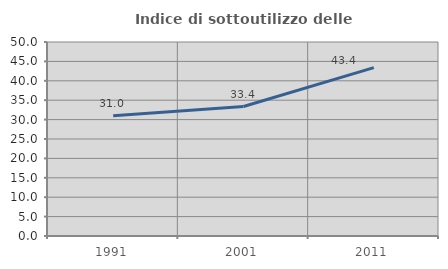
| Category | Indice di sottoutilizzo delle abitazioni  |
|---|---|
| 1991.0 | 31.018 |
| 2001.0 | 33.371 |
| 2011.0 | 43.386 |